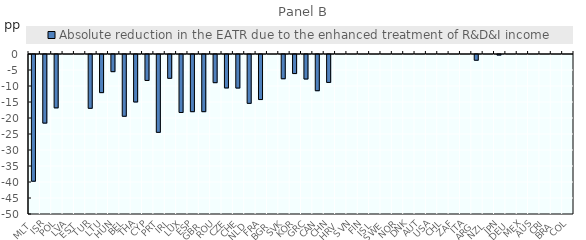
| Category | Absolute reduction in the EATR due to the enhanced treatment of R&D&I income |
|---|---|
| MLT | -39.604 |
| ISR | -21.44 |
| POL | -16.675 |
| LVA | 0 |
| EST | 0 |
| TUR | -16.813 |
| LTU | -11.911 |
| HUN | -5.36 |
| BEL | -19.303 |
| THA | -14.838 |
| CYP | -8.109 |
| PRT | -24.322 |
| IRL | -7.444 |
| LUX | -18.124 |
| ESP | -17.866 |
| GBR | -17.866 |
| ROU | -8.803 |
| CZE | -10.453 |
| CHE | -10.483 |
| NLD | -15.261 |
| FRA | -14.076 |
| BGR | 0 |
| SVK | -7.578 |
| KOR | -5.955 |
| GRC | -7.658 |
| CAN | -11.315 |
| CHN | -8.728 |
| HRV | 0 |
| SVN | 0 |
| FIN | 0 |
| ISL | 0 |
| SWE | 0 |
| NOR | 0 |
| DNK | 0 |
| AUT | 0 |
| USA | 0 |
| CHL | 0 |
| ZAF | 0 |
| ITA | 0 |
| ARG | -1.792 |
| NZL | 0 |
| JPN | -0.177 |
| DEU | 0 |
| MEX | 0 |
| AUS | 0 |
| CRI | 0 |
| BRA | 0 |
| COL | 0 |